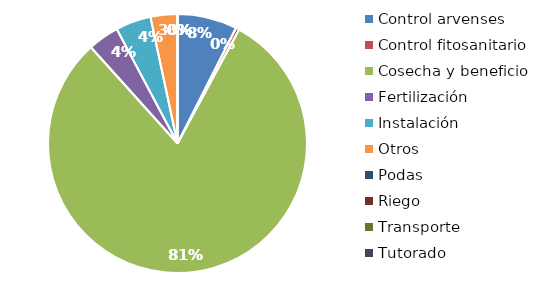
| Category | Valor |
|---|---|
| Control arvenses | 2240000 |
| Control fitosanitario | 130000 |
| Cosecha y beneficio | 24168750 |
| Fertilización | 1170000 |
| Instalación | 1326000 |
| Otros | 1007500 |
| Podas | 0 |
| Riego | 0 |
| Transporte | 0 |
| Tutorado | 0 |